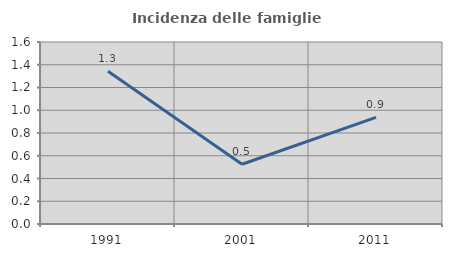
| Category | Incidenza delle famiglie numerose |
|---|---|
| 1991.0 | 1.342 |
| 2001.0 | 0.525 |
| 2011.0 | 0.938 |